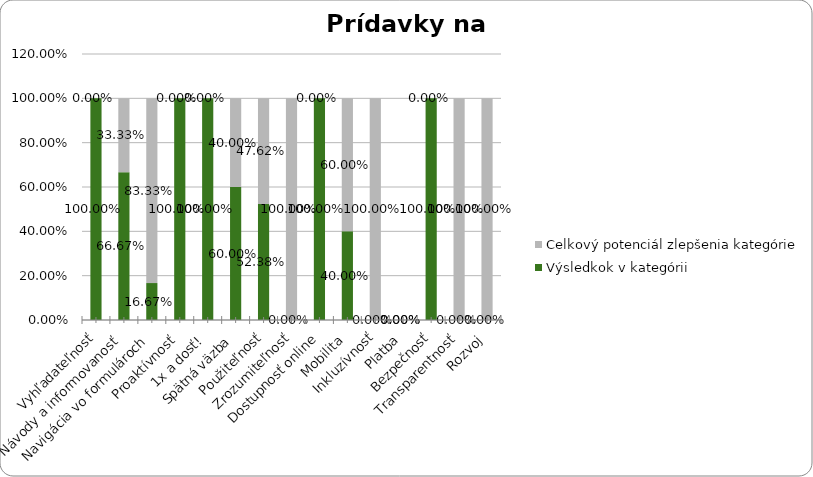
| Category | Výsledkok v kategórii | Celkový potenciál zlepšenia kategórie |
|---|---|---|
| Vyhľadateľnosť | 1 | 0 |
| Návody a informovanosť | 0.667 | 0.333 |
| Navigácia vo formulároch | 0.167 | 0.833 |
| Proaktívnosť | 1 | 0 |
| 1x a dosť! | 1 | 0 |
| Spätná väzba | 0.6 | 0.4 |
| Použiteľnosť | 0.524 | 0.476 |
| Zrozumiteľnosť | 0 | 1 |
| Dostupnosť online | 1 | 0 |
| Mobilita | 0.4 | 0.6 |
| Inkluzívnosť | 0 | 1 |
| Platba | 0 | 0 |
| Bezpečnosť | 1 | 0 |
| Transparentnosť | 0 | 1 |
| Rozvoj | 0 | 1 |